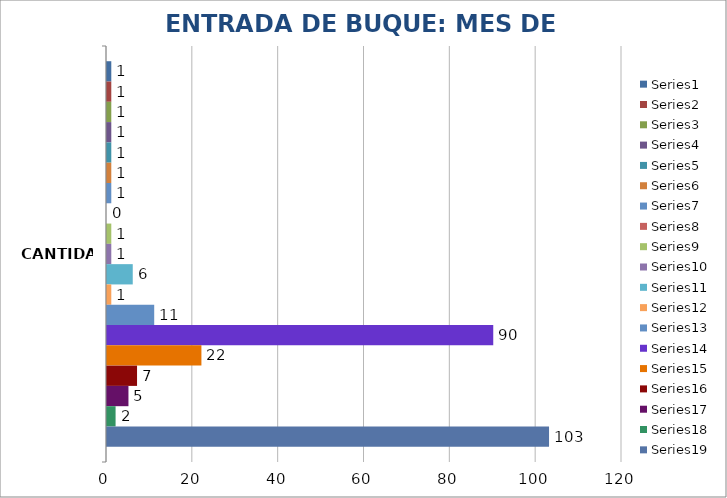
| Category | Series 0 | Series 1 | Series 2 | Series 3 | Series 4 | Series 5 | Series 6 | Series 7 | Series 8 | Series 9 | Series 10 | Series 11 | Series 12 | Series 13 | Series 14 | Series 15 | Series 16 | Series 17 | Series 18 |
|---|---|---|---|---|---|---|---|---|---|---|---|---|---|---|---|---|---|---|---|
| CANTIDAD | 1 | 1 | 1 | 1 | 1 | 1 | 1 | 0 | 1 | 1 | 6 | 1 | 11 | 90 | 22 | 7 | 5 | 2 | 103 |